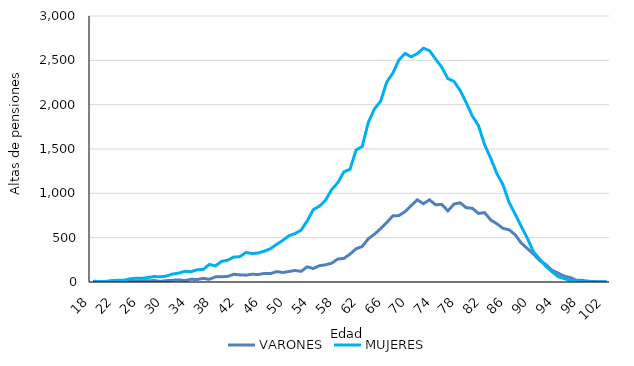
| Category | VARONES | MUJERES |
|---|---|---|
| 18.0 | 4 | 9 |
| 19.0 | 1 | 5 |
| 20.0 | 5 | 5 |
| 21.0 | 12 | 13 |
| 22.0 | 12 | 19 |
| 23.0 | 7 | 19 |
| 24.0 | 7 | 35 |
| 25.0 | 8 | 42 |
| 26.0 | 12 | 41 |
| 27.0 | 14 | 51 |
| 28.0 | 16 | 62 |
| 29.0 | 7 | 58 |
| 30.0 | 15 | 67 |
| 31.0 | 20 | 90 |
| 32.0 | 24 | 100 |
| 33.0 | 16 | 121 |
| 34.0 | 31 | 116 |
| 35.0 | 27 | 138 |
| 36.0 | 41 | 141 |
| 37.0 | 30 | 198 |
| 38.0 | 58 | 182 |
| 39.0 | 59 | 232 |
| 40.0 | 63 | 246 |
| 41.0 | 87 | 281 |
| 42.0 | 80 | 286 |
| 43.0 | 77 | 333 |
| 44.0 | 88 | 321 |
| 45.0 | 84 | 327 |
| 46.0 | 97 | 348 |
| 47.0 | 95 | 376 |
| 48.0 | 117 | 424 |
| 49.0 | 107 | 469 |
| 50.0 | 118 | 521 |
| 51.0 | 130 | 546 |
| 52.0 | 120 | 585 |
| 53.0 | 171 | 688 |
| 54.0 | 152 | 816 |
| 55.0 | 184 | 855 |
| 56.0 | 194 | 922 |
| 57.0 | 212 | 1042 |
| 58.0 | 259 | 1119 |
| 59.0 | 266 | 1242 |
| 60.0 | 314 | 1271 |
| 61.0 | 375 | 1489 |
| 62.0 | 401 | 1529 |
| 63.0 | 488 | 1801 |
| 64.0 | 539 | 1953 |
| 65.0 | 602 | 2037 |
| 66.0 | 670 | 2254 |
| 67.0 | 746 | 2356 |
| 68.0 | 749 | 2505 |
| 69.0 | 794 | 2578 |
| 70.0 | 861 | 2540 |
| 71.0 | 927 | 2575 |
| 72.0 | 883 | 2637 |
| 73.0 | 927 | 2609 |
| 74.0 | 870 | 2514 |
| 75.0 | 876 | 2422 |
| 76.0 | 802 | 2294 |
| 77.0 | 879 | 2262 |
| 78.0 | 893 | 2161 |
| 79.0 | 838 | 2022 |
| 80.0 | 832 | 1871 |
| 81.0 | 773 | 1764 |
| 82.0 | 782 | 1549 |
| 83.0 | 700 | 1396 |
| 84.0 | 657 | 1224 |
| 85.0 | 605 | 1098 |
| 86.0 | 589 | 898 |
| 87.0 | 533 | 765 |
| 88.0 | 439 | 626 |
| 89.0 | 377 | 492 |
| 90.0 | 315 | 340 |
| 91.0 | 242 | 260 |
| 92.0 | 198 | 178 |
| 93.0 | 133 | 117 |
| 94.0 | 101 | 62 |
| 95.0 | 66 | 39 |
| 96.0 | 50 | 17 |
| 97.0 | 20 | 18 |
| 98.0 | 18 | 4 |
| 99.0 | 8 | 4 |
| 100.0 | 5 | 1 |
| 101.0 | 3 | 1 |
| 102.0 | 1 | 0 |